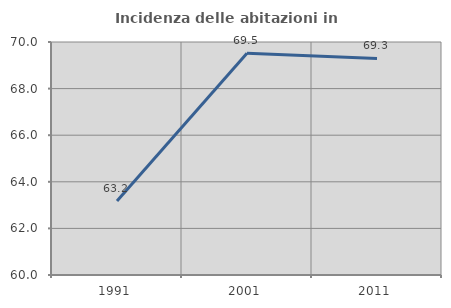
| Category | Incidenza delle abitazioni in proprietà  |
|---|---|
| 1991.0 | 63.177 |
| 2001.0 | 69.519 |
| 2011.0 | 69.297 |